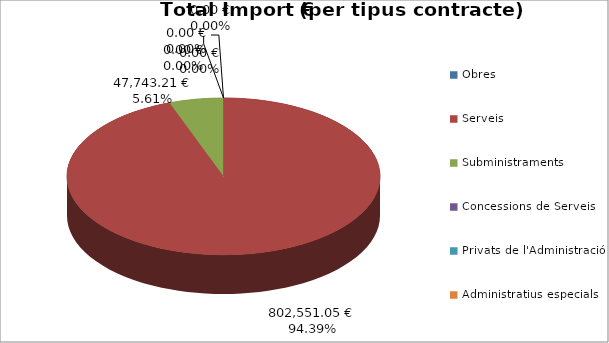
| Category | Total preu              (amb iva) |
|---|---|
| Obres | 0 |
| Serveis | 802551.047 |
| Subministraments | 47743.212 |
| Concessions de Serveis | 0 |
| Privats de l'Administració | 0 |
| Administratius especials | 0 |